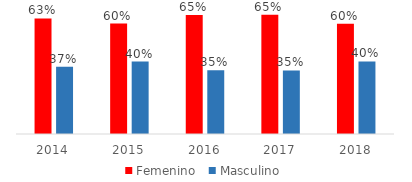
| Category | Femenino | Masculino |
|---|---|---|
| 2014.0 | 0.632 | 0.368 |
| 2015.0 | 0.604 | 0.396 |
| 2016.0 | 0.651 | 0.349 |
| 2017.0 | 0.652 | 0.348 |
| 2018.0 | 0.603 | 0.397 |